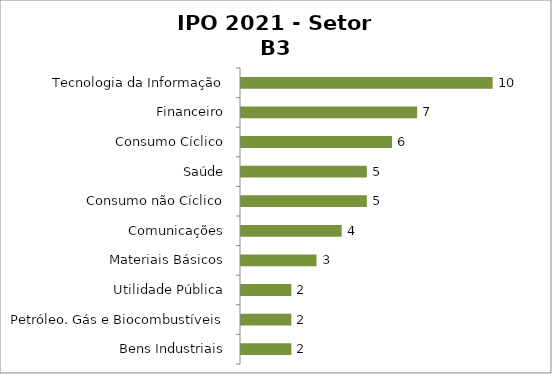
| Category | Setor B3 |
|---|---|
| Tecnologia da Informação | 10 |
| Financeiro | 7 |
| Consumo Cíclico | 6 |
| Saúde | 5 |
| Consumo não Cíclico | 5 |
| Comunicações | 4 |
| Materiais Básicos | 3 |
| Utilidade Pública | 2 |
| Petróleo. Gás e Biocombustíveis | 2 |
| Bens Industriais | 2 |